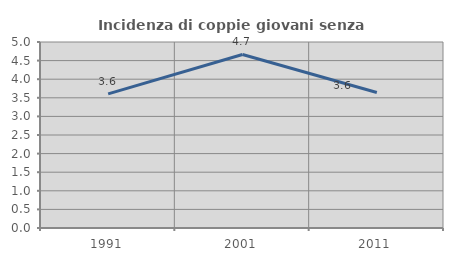
| Category | Incidenza di coppie giovani senza figli |
|---|---|
| 1991.0 | 3.607 |
| 2001.0 | 4.666 |
| 2011.0 | 3.642 |